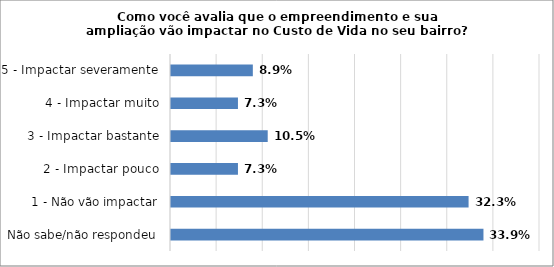
| Category | Series 0 |
|---|---|
| Não sabe/não respondeu | 0.339 |
| 1 - Não vão impactar | 0.323 |
| 2 - Impactar pouco | 0.073 |
| 3 - Impactar bastante | 0.105 |
| 4 - Impactar muito | 0.073 |
| 5 - Impactar severamente | 0.089 |